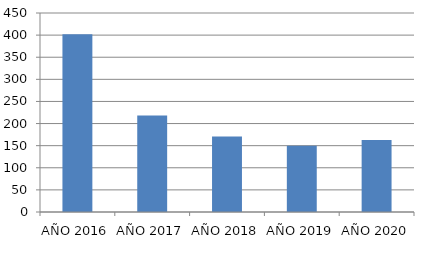
| Category | Series 0 |
|---|---|
| AÑO 2016 | 402 |
| AÑO 2017 | 218 |
| AÑO 2018 | 171 |
| AÑO 2019 | 150 |
| AÑO 2020 | 163 |